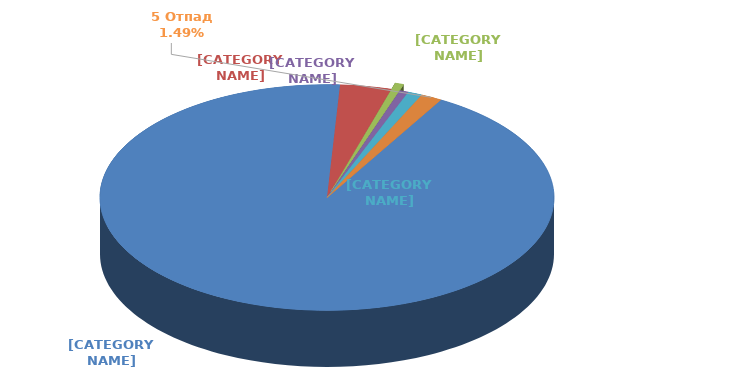
| Category | As [t] |
|---|---|
| 1A1 Производство на енергија | 0.415 |
| 1A2 Согорување во производни индустрии и градежништво | 0.016 |
| 1А3 Транспорт | 0.003 |
| 1A4 Други сектори (домаќинства, комерцијален, административен) | 0.003 |
| 2 Индустриски процеси | 0.005 |
| 5 Отпад | 0.007 |